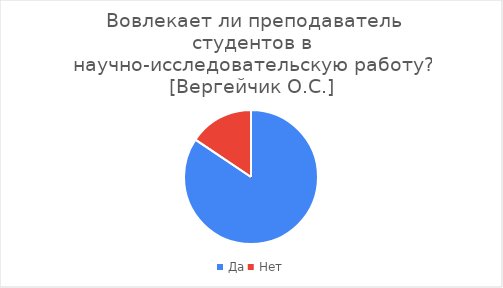
| Category | Series 0 |
|---|---|
| Да | 65 |
| Нет | 12 |